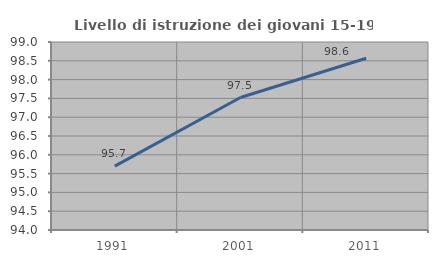
| Category | Livello di istruzione dei giovani 15-19 anni |
|---|---|
| 1991.0 | 95.697 |
| 2001.0 | 97.523 |
| 2011.0 | 98.567 |